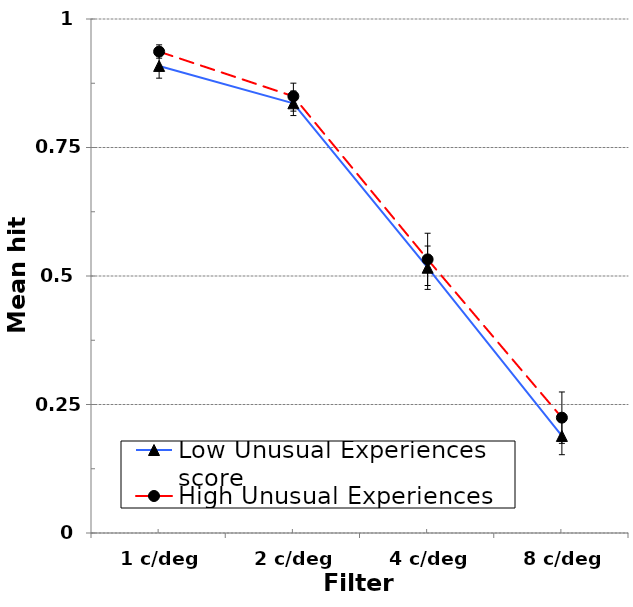
| Category | Low Unusual Experiences score | High Unusual Experiences score |
|---|---|---|
| 1 c/deg | 0.909 | 0.937 |
| 2 c/deg | 0.836 | 0.85 |
| 4 c/deg | 0.516 | 0.532 |
| 8 c/deg | 0.189 | 0.224 |